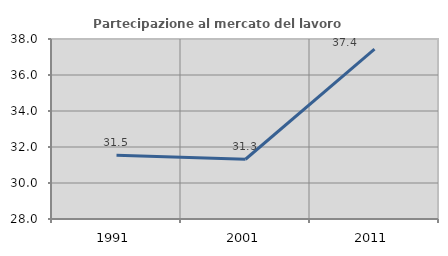
| Category | Partecipazione al mercato del lavoro  femminile |
|---|---|
| 1991.0 | 31.536 |
| 2001.0 | 31.319 |
| 2011.0 | 37.437 |